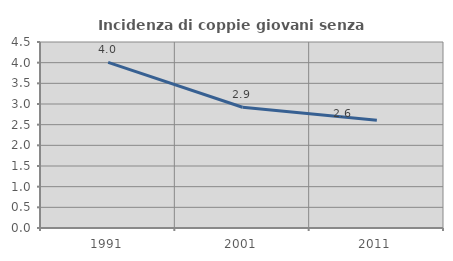
| Category | Incidenza di coppie giovani senza figli |
|---|---|
| 1991.0 | 4.007 |
| 2001.0 | 2.921 |
| 2011.0 | 2.604 |